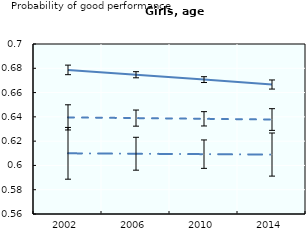
| Category | Healthy weight | Overweight | Obese |
|---|---|---|---|
| 2002.0 | 0.679 | 0.64 | 0.61 |
| 2006.0 | 0.675 | 0.639 | 0.61 |
| 2010.0 | 0.671 | 0.638 | 0.609 |
| 2014.0 | 0.667 | 0.638 | 0.609 |